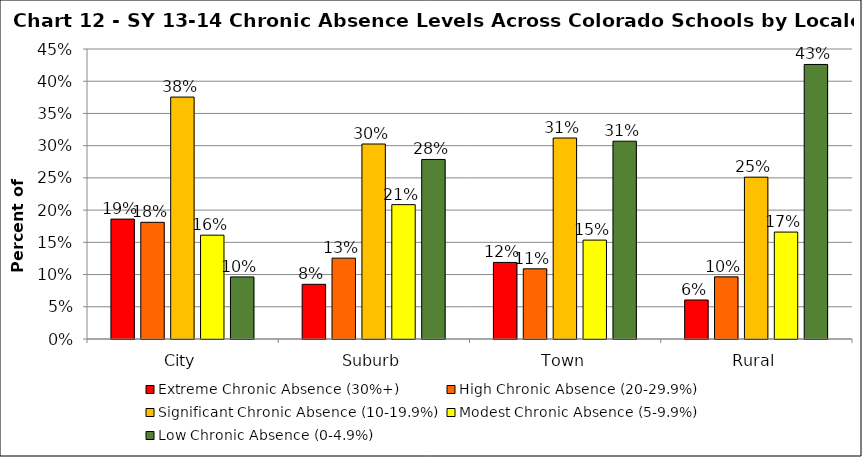
| Category | Extreme Chronic Absence (30%+) | High Chronic Absence (20-29.9%) | Significant Chronic Absence (10-19.9%) | Modest Chronic Absence (5-9.9%) | Low Chronic Absence (0-4.9%) |
|---|---|---|---|---|---|
| 0 | 0.186 | 0.181 | 0.375 | 0.161 | 0.096 |
| 1 | 0.085 | 0.125 | 0.303 | 0.208 | 0.279 |
| 2 | 0.119 | 0.109 | 0.312 | 0.153 | 0.307 |
| 3 | 0.061 | 0.096 | 0.251 | 0.166 | 0.426 |